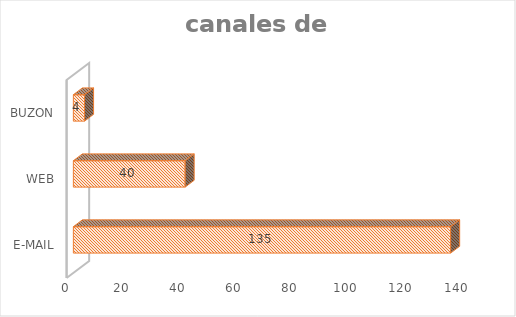
| Category | Series 0 |
|---|---|
| E-MAIL | 135 |
| WEB | 40 |
| BUZON | 4 |